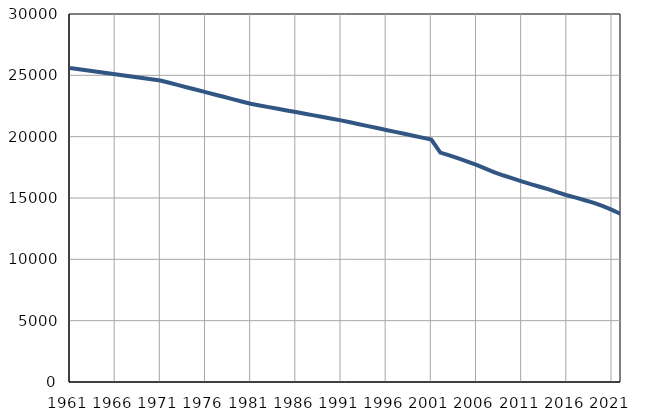
| Category | Population
size |
|---|---|
| 1961.0 | 25606 |
| 1962.0 | 25504 |
| 1963.0 | 25401 |
| 1964.0 | 25299 |
| 1965.0 | 25196 |
| 1966.0 | 25094 |
| 1967.0 | 24991 |
| 1968.0 | 24889 |
| 1969.0 | 24786 |
| 1970.0 | 24684 |
| 1971.0 | 24581 |
| 1972.0 | 24391 |
| 1973.0 | 24201 |
| 1974.0 | 24010 |
| 1975.0 | 23820 |
| 1976.0 | 23630 |
| 1977.0 | 23440 |
| 1978.0 | 23250 |
| 1979.0 | 23059 |
| 1980.0 | 22869 |
| 1981.0 | 22679 |
| 1982.0 | 22544 |
| 1983.0 | 22409 |
| 1984.0 | 22275 |
| 1985.0 | 22140 |
| 1986.0 | 22005 |
| 1987.0 | 21870 |
| 1988.0 | 21735 |
| 1989.0 | 21601 |
| 1990.0 | 21466 |
| 1991.0 | 21331 |
| 1992.0 | 21175 |
| 1993.0 | 21018 |
| 1994.0 | 20862 |
| 1995.0 | 20705 |
| 1996.0 | 20549 |
| 1997.0 | 20392 |
| 1998.0 | 20236 |
| 1999.0 | 20079 |
| 2000.0 | 19923 |
| 2001.0 | 19766 |
| 2002.0 | 18699 |
| 2003.0 | 18474 |
| 2004.0 | 18224 |
| 2005.0 | 17961 |
| 2006.0 | 17692 |
| 2007.0 | 17394 |
| 2008.0 | 17087 |
| 2009.0 | 16832 |
| 2010.0 | 16602 |
| 2011.0 | 16362 |
| 2012.0 | 16128 |
| 2013.0 | 15916 |
| 2014.0 | 15706 |
| 2015.0 | 15458 |
| 2016.0 | 15226 |
| 2017.0 | 15025 |
| 2018.0 | 14814 |
| 2019.0 | 14601 |
| 2020.0 | 14343 |
| 2021.0 | 14029 |
| 2022.0 | 13692 |